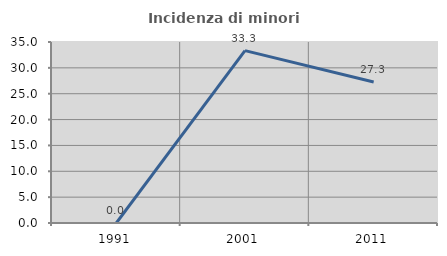
| Category | Incidenza di minori stranieri |
|---|---|
| 1991.0 | 0 |
| 2001.0 | 33.333 |
| 2011.0 | 27.273 |